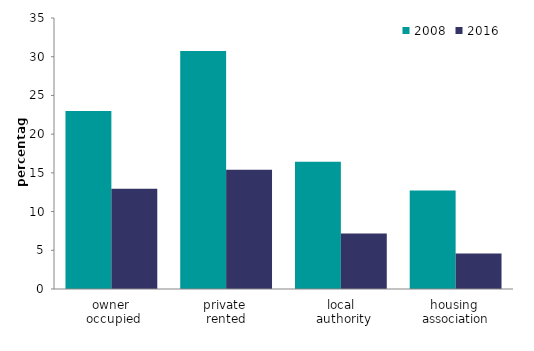
| Category | 2008 | 2016 |
|---|---|---|
| owner
 occupied | 22.999 | 12.945 |
| private 
rented | 30.735 | 15.395 |
| local
 authority | 16.431 | 7.161 |
| housing 
association | 12.728 | 4.59 |